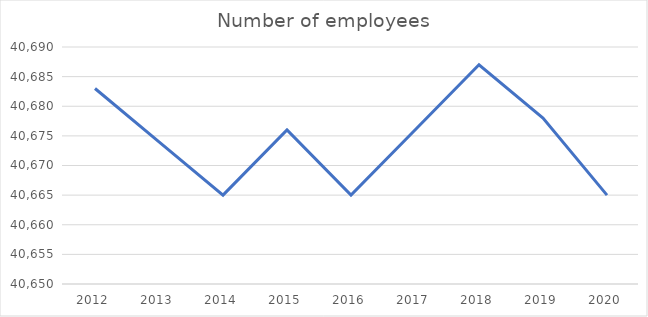
| Category | Number of employees |
|---|---|
| 2012.0 | 40683 |
| 2013.0 | 40674 |
| 2014.0 | 40665 |
| 2015.0 | 40676 |
| 2016.0 | 40665 |
| 2017.0 | 40676 |
| 2018.0 | 40687 |
| 2019.0 | 40678 |
| 2020.0 | 40665 |